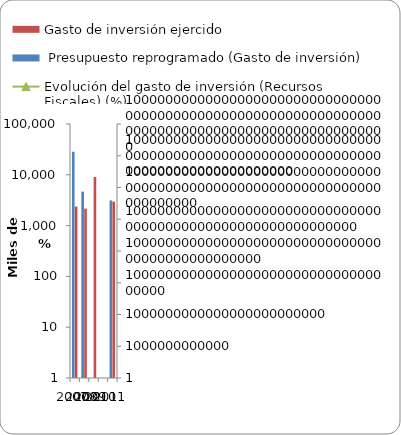
| Category |  Presupuesto reprogramado (Gasto de inversión) | Gasto de inversión ejercido |
|---|---|---|
| 2007 | 28441 | 2372 |
| 2008 | 4672 | 2162 |
| 2009 | 0 | 9044 |
| 2010 | 0 | 0 |
| 2011 | 3119 | 2970 |